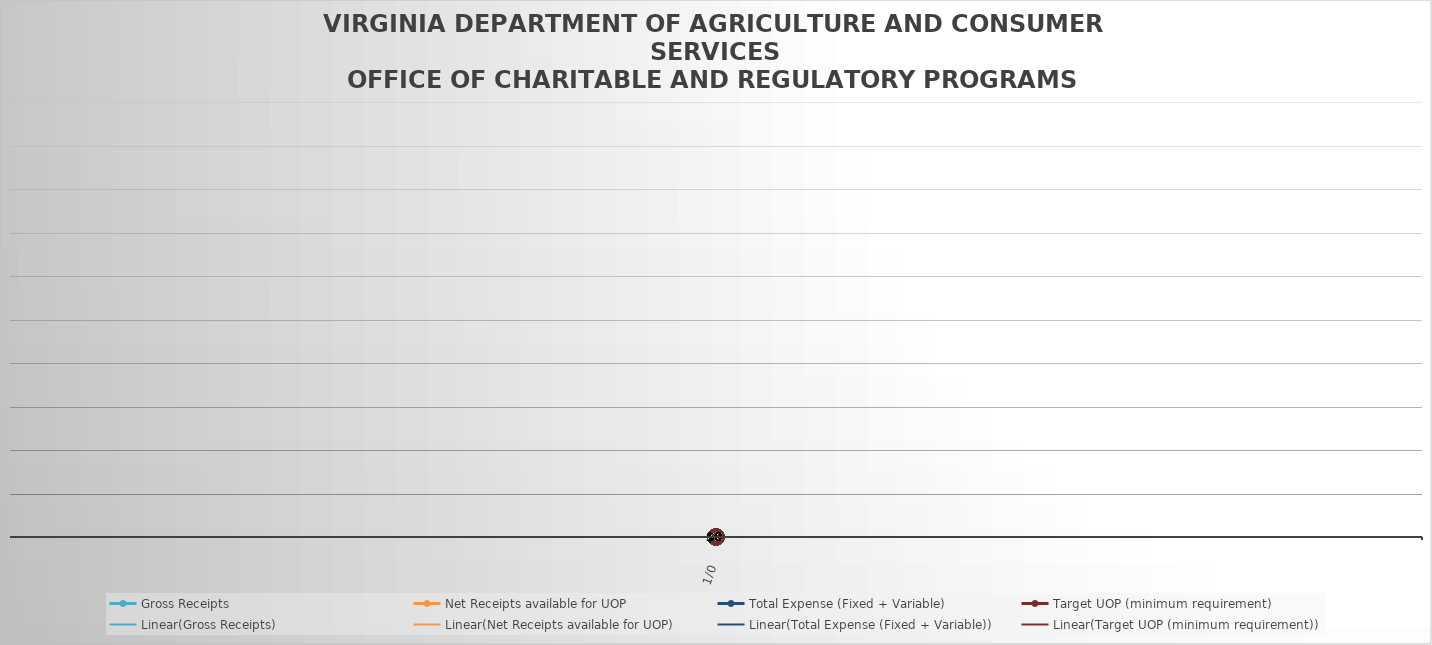
| Category | Gross Receipts | Net Receipts available for UOP | Total Expense (Fixed + Variable) | Target UOP (minimum requirement) |
|---|---|---|---|---|
| 0.0 | 0 | 0 | 0 | 0 |
| 0.0 | 0 | 0 | 0 | 0 |
| 0.0 | 0 | 0 | 0 | 0 |
| 0.0 | 0 | 0 | 0 | 0 |
| 0.0 | 0 | 0 | 0 | 0 |
| 0.0 | 0 | 0 | 0 | 0 |
| 0.0 | 0 | 0 | 0 | 0 |
| 0.0 | 0 | 0 | 0 | 0 |
| 0.0 | 0 | 0 | 0 | 0 |
| 0.0 | 0 | 0 | 0 | 0 |
| 0.0 | 0 | 0 | 0 | 0 |
| 0.0 | 0 | 0 | 0 | 0 |
| 0.0 | 0 | 0 | 0 | 0 |